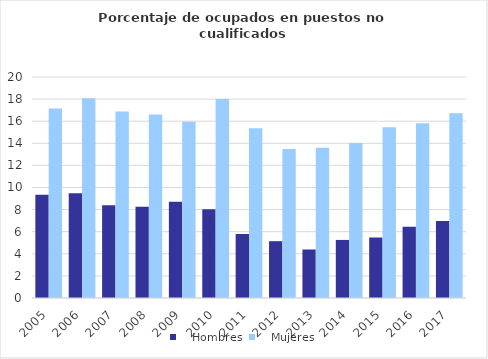
| Category |    Hombres |    Mujeres |
|---|---|---|
| 2005.0 | 9.333 | 17.156 |
| 2006.0 | 9.469 | 18.085 |
| 2007.0 | 8.396 | 16.874 |
| 2008.0 | 8.257 | 16.605 |
| 2009.0 | 8.701 | 15.939 |
| 2010.0 | 8.042 | 18 |
| 2011.0 | 5.799 | 15.36 |
| 2012.0 | 5.141 | 13.477 |
| 2013.0 | 4.389 | 13.595 |
| 2014.0 | 5.256 | 14.037 |
| 2015.0 | 5.475 | 15.457 |
| 2016.0 | 6.453 | 15.81 |
| 2017.0 | 6.958 | 16.711 |